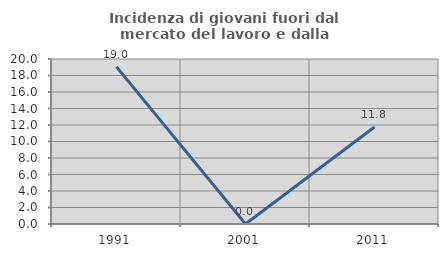
| Category | Incidenza di giovani fuori dal mercato del lavoro e dalla formazione  |
|---|---|
| 1991.0 | 19.048 |
| 2001.0 | 0 |
| 2011.0 | 11.765 |